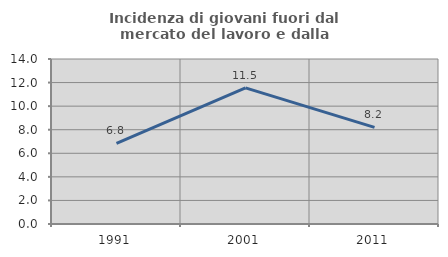
| Category | Incidenza di giovani fuori dal mercato del lavoro e dalla formazione  |
|---|---|
| 1991.0 | 6.846 |
| 2001.0 | 11.549 |
| 2011.0 | 8.197 |